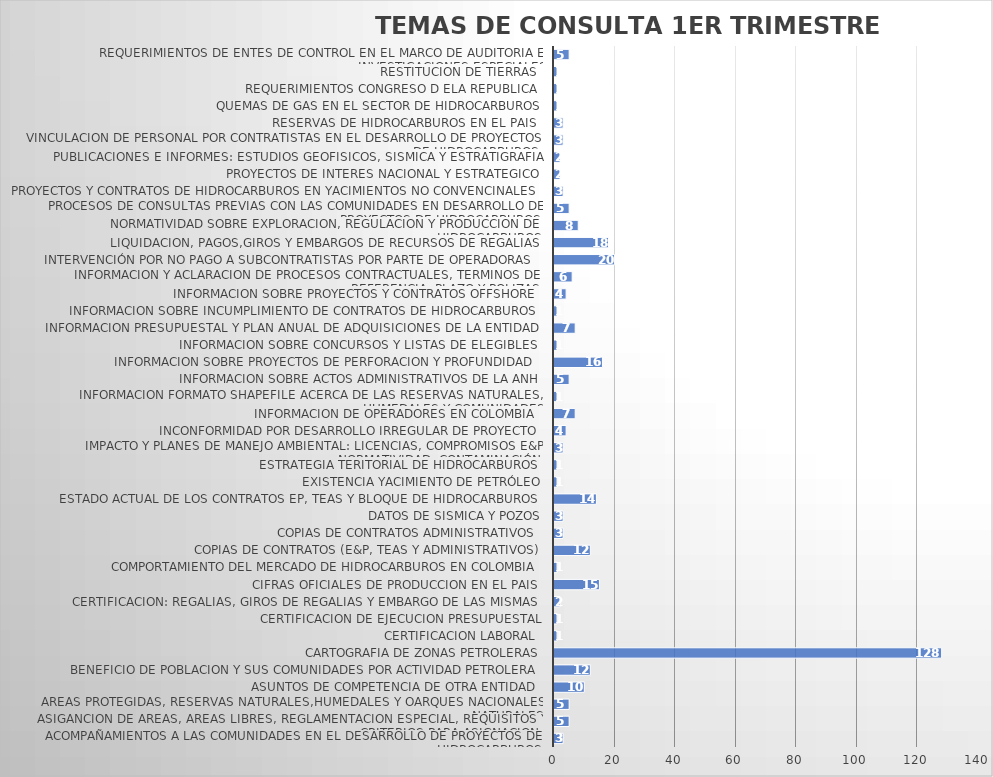
| Category | Series 0 |
|---|---|
| acompañamientos a las comunidades en el desarrollo de proyectos de hidrocarburos | 3 |
| asigancion de areas, areas libres, reglamentacion especial, requisitos y criterios para asignacion  | 5 |
| areas protegidas, reservas naturales,humedales y oarques nacionales naturales | 5 |
| asuntos de competencia de otra entidad  | 10 |
| beneficio de poblacion y sus comunidades por actividad petrolera  | 12 |
| cartografia de zonas petroleras | 128 |
| certificacion laboral  | 1 |
| certificacion de ejecucion presupuestal | 1 |
| certificacion: regalias, giros de regalias y embargo de las mismas  | 2 |
| cifras oficiales de produccion en el pais  | 15 |
| comportamiento del mercado de hidrocarburos en colombia | 1 |
| Copias de contratos (E&P, TEAS y Administrativos) | 12 |
| copias de contratos administrativos  | 3 |
| datos de sismica y pozos | 3 |
| estado actual de los contratos EP, TEAS y bloque de hidrocarburos | 14 |
| Existencia yacimiento de Petróleo | 1 |
| estrategia teritorial de hidrocarburos | 1 |
| Impacto y planes de manejo ambiental: Licencias, compromisos E&P normatividad, contaminación | 3 |
| Inconformidad por desarrollo irregular de proyecto | 4 |
| informacion de operadores en colombia  | 7 |
| informacion formato shapefile acerca de las reservas naturales, humedales y comunidades | 1 |
| informacion sobre actos administrativos de la ANH | 5 |
| informacion sobre proyectos de perforacion y profundidad  | 16 |
| informacion sobre concursos y listas de elegibles  | 1 |
| informacion presupuestal y plan anual de adquisiciones de la entidad  | 7 |
| informacion sobre incumplimiento de contratos de hidrocarburos | 1 |
| informacion sobre proyectos y contratos offshore | 4 |
| informacion y aclaracion de procesos contractuales, terminos de referencia, plazo y polizas  | 6 |
| Intervención por no pago a subcontratistas por parte de Operadoras  | 20 |
| liquidacion, pagos,giros y embargos de recursos de regalias | 18 |
| normatividad sobre exploracion, regulacion y produccion de hidrocarburos | 8 |
| procesos de consultas previas con las comunidades en desarrollo de proyectos de hidrocarburos | 5 |
| proyectos y contratos de hidrocarburos en yacimientos no convencinales  | 3 |
| proyectos de interes nacional y estrategico | 2 |
| publicaciones e informes: estudios geofisicos, sismica y estratigrafia | 2 |
| vinculacion de personal por contratistas en el desarrollo de proyectos de hidrocarburos  | 3 |
| reservas de hidrocarburos en el pais  | 3 |
| quemas de gas en el sector de hidrocarburos | 1 |
| requerimientos congreso d ela republica  | 1 |
| restitucion de tierras  | 1 |
| requerimientos de entes de control en el marco de auditoria e investigaciones especiales | 5 |